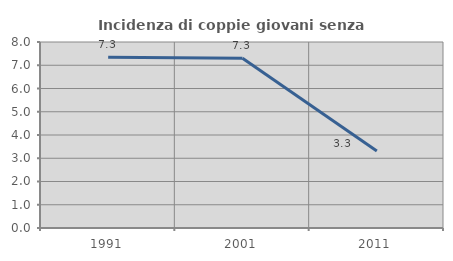
| Category | Incidenza di coppie giovani senza figli |
|---|---|
| 1991.0 | 7.346 |
| 2001.0 | 7.304 |
| 2011.0 | 3.313 |